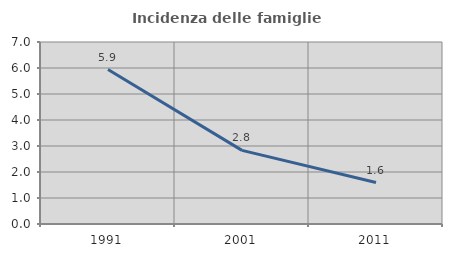
| Category | Incidenza delle famiglie numerose |
|---|---|
| 1991.0 | 5.94 |
| 2001.0 | 2.833 |
| 2011.0 | 1.596 |